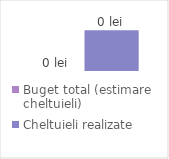
| Category | Buget total (estimare cheltuieli) | Cheltuieli realizate |
|---|---|---|
| 0 | 0 | 0 |